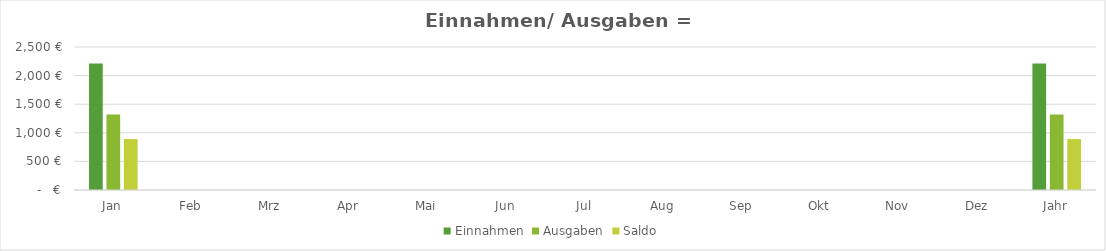
| Category | Einnahmen | Ausgaben | Saldo |
|---|---|---|---|
| Jan | 2210 | 1319 | 891 |
| Feb | 0 | 0 | 0 |
| Mrz | 0 | 0 | 0 |
| Apr | 0 | 0 | 0 |
| Mai | 0 | 0 | 0 |
| Jun | 0 | 0 | 0 |
| Jul | 0 | 0 | 0 |
| Aug | 0 | 0 | 0 |
| Sep | 0 | 0 | 0 |
| Okt | 0 | 0 | 0 |
| Nov | 0 | 0 | 0 |
| Dez | 0 | 0 | 0 |
| Jahr | 2210 | 1319 | 891 |